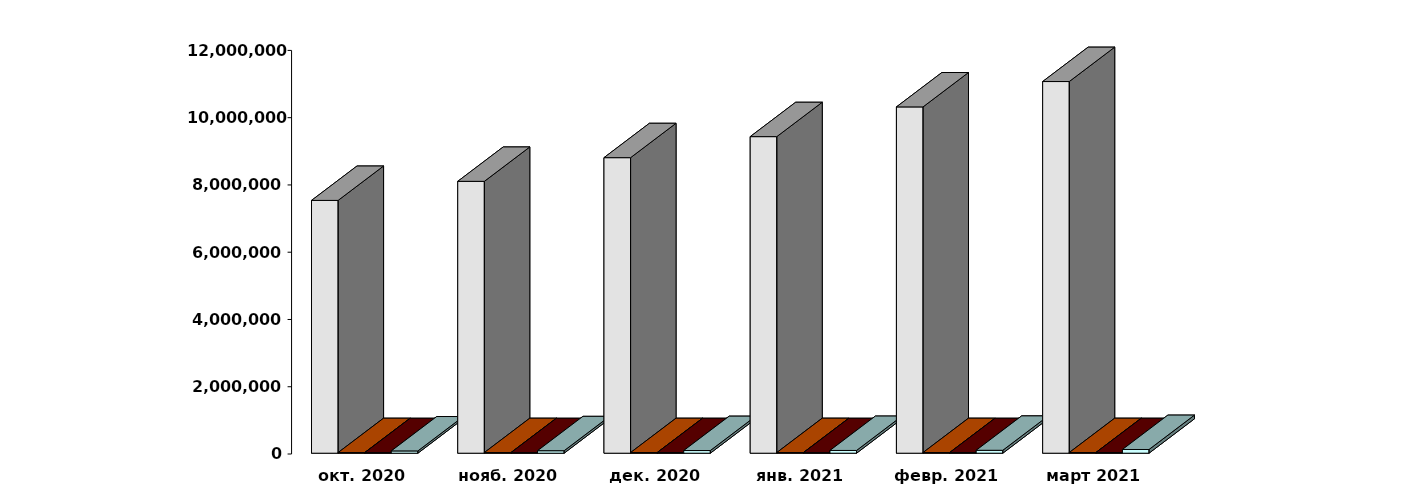
| Category | Физические лица | Юридические лица | Иностранные лица | Клиенты, передавшие свои средства в ДУ |
|---|---|---|---|---|
| 2020-10-28 | 7515934 | 18680 | 16861 | 67792 |
| 2020-11-28 | 8083085 | 18780 | 17081 | 73469 |
| 2020-12-28 | 8787077 | 19014 | 17268 | 79270 |
| 2021-01-28 | 9412672 | 19074 | 17041 | 82193 |
| 2021-02-28 | 10296032 | 19173 | 17445 | 86734 |
| 2021-03-31 | 11050505 | 19312 | 17990 | 110250 |